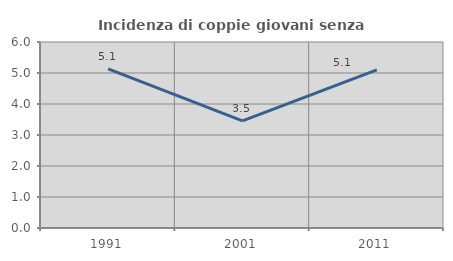
| Category | Incidenza di coppie giovani senza figli |
|---|---|
| 1991.0 | 5.133 |
| 2001.0 | 3.456 |
| 2011.0 | 5.102 |